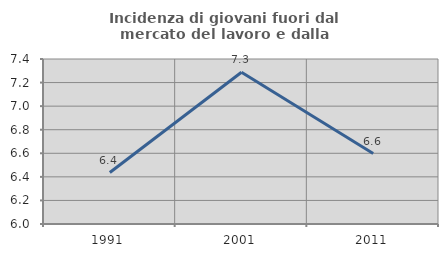
| Category | Incidenza di giovani fuori dal mercato del lavoro e dalla formazione  |
|---|---|
| 1991.0 | 6.437 |
| 2001.0 | 7.288 |
| 2011.0 | 6.598 |